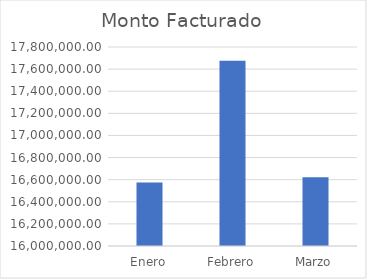
| Category | Monto Facturado |
|---|---|
| Enero | 16573986 |
| Febrero | 17676216 |
| Marzo | 16622003 |